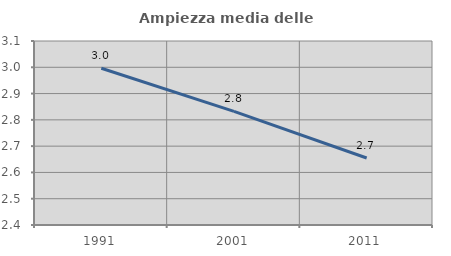
| Category | Ampiezza media delle famiglie |
|---|---|
| 1991.0 | 2.997 |
| 2001.0 | 2.833 |
| 2011.0 | 2.655 |